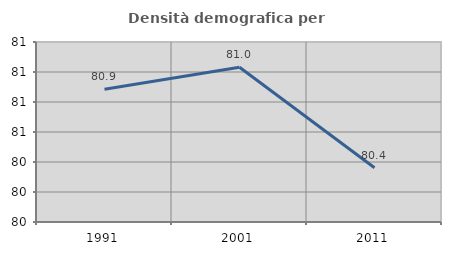
| Category | Densità demografica |
|---|---|
| 1991.0 | 80.884 |
| 2001.0 | 81.031 |
| 2011.0 | 80.362 |